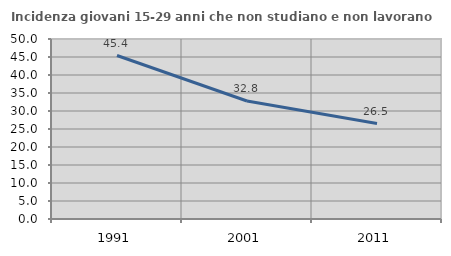
| Category | Incidenza giovani 15-29 anni che non studiano e non lavorano  |
|---|---|
| 1991.0 | 45.416 |
| 2001.0 | 32.776 |
| 2011.0 | 26.51 |